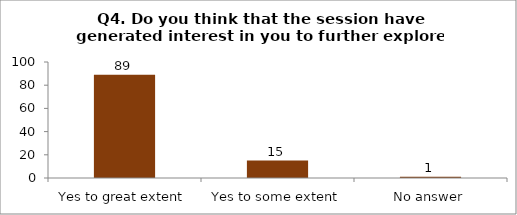
| Category | Q4. Do you think that the session have generated interest in you to further explore the topics? |
|---|---|
| Yes to great extent | 89 |
| Yes to some extent | 15 |
| No answer | 1 |